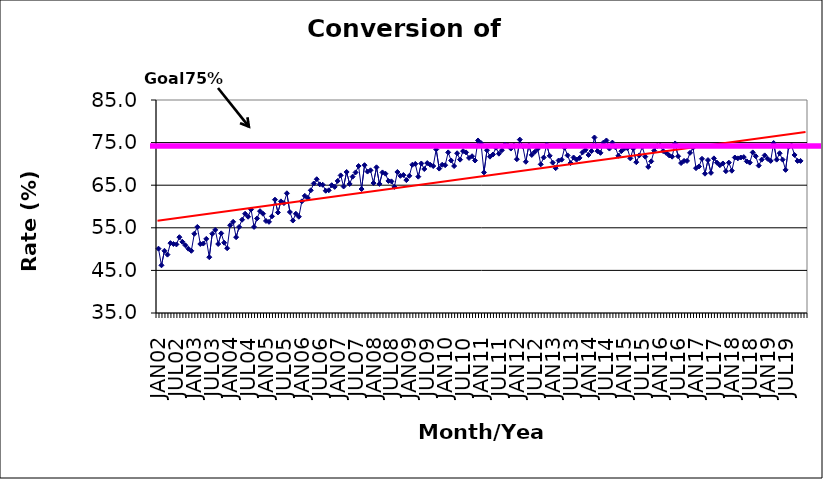
| Category | Series 0 |
|---|---|
| JAN02 | 50.1 |
| FEB02 | 46.2 |
| MAR02 | 49.6 |
| APR02 | 48.7 |
| MAY02 | 51.4 |
| JUN02 | 51.2 |
| JUL02 | 51.1 |
| AUG02 | 52.8 |
| SEP02 | 51.7 |
| OCT02 | 50.9 |
| NOV02 | 50.1 |
| DEC02 | 49.6 |
| JAN03 | 53.6 |
| FEB03 | 55.2 |
| MAR03 | 51.2 |
| APR03 | 51.3 |
| MAY03 | 52.4 |
| JUN03 | 48.1 |
| JUL03 | 53.6 |
| AUG03 | 54.5 |
| SEP03 | 51.2 |
| OCT03 | 53.7 |
| NOV03 | 51.5 |
| DEC03 | 50.2 |
| JAN04 | 55.6 |
| FEB04 | 56.4 |
| MAR04 | 52.8 |
| APR04 | 55.2 |
| MAY04 | 56.9 |
| JUN04 | 58.3 |
| JUL04 | 57.6 |
| AUG04 | 59.3 |
| SEP04 | 55.2 |
| OCT04 | 57.2 |
| NOV04 | 58.9 |
| DEC04 | 58.3 |
| JAN05 | 56.6 |
| FEB05 | 56.4 |
| MAR05 | 57.7 |
| APR05 | 61.6 |
| MAY05 | 58.6 |
| JUN05 | 61.2 |
| JUL05 | 60.8 |
| AUG05 | 63.1 |
| SEP05 | 58.7 |
| OCT05 | 56.7 |
| NOV05 | 58.3 |
| DEC05 | 57.6 |
| JAN06 | 61.2 |
| FEB06 | 62.5 |
| MAR06 | 62 |
| APR06 | 63.8 |
| MAY06 | 65.4 |
| JUN06 | 66.4 |
| JUL06 | 65.2 |
| AUG06 | 65.1 |
| SEP06 | 63.7 |
| OCT06 | 63.8 |
| NOV06 | 65 |
| DEC06 | 64.6 |
| JAN07 | 66 |
| FEB07 | 67.3 |
| MAR07 | 64.7 |
| APR07 | 68.1 |
| MAY07 | 65.3 |
| JUN07 | 67 |
| JUL07 | 68 |
| AUG07 | 69.5 |
| SEP07 | 64.1 |
| OCT07 | 69.7 |
| NOV07 | 68.2 |
| DEC07 | 68.5 |
| JAN08 | 65.5 |
| FEB08 | 69.2 |
| MAR08 | 65.3 |
| APR08 | 68 |
| MAY08 | 67.7 |
| JUN08 | 66 |
| JUL08 | 65.9 |
| AUG08 | 64.6 |
| SEP08 | 68.1 |
| OCT08 | 67.2 |
| NOV08 | 67.4 |
| DEC08 | 66.2 |
| JAN09 | 67.2 |
| FEB09 | 69.8 |
| MAR09 | 70 |
| APR09 | 67 |
| MAY09 | 70.1 |
| JUN09 | 68.8 |
| JUL09 | 70.2 |
| AUG09 | 69.8 |
| SEP09 | 69.5 |
| OCT09 | 73.4 |
| NOV09 | 68.9 |
| DEC09 | 69.8 |
| JAN10 | 69.7 |
| FEB10 | 72.7 |
| MAR10 | 70.8 |
| APR10 | 69.5 |
| MAY10 | 72.5 |
| JUN10 | 71 |
| JUL10 | 73 |
| AUG10 | 72.7 |
| SEP10 | 71.4 |
| OCT10 | 71.8 |
| NOV10 | 70.8 |
| DEC10 | 75.5 |
| JAN11 | 74.9 |
| FEB11 | 68 |
| MAR11 | 73.2 |
| APR11 | 71.7 |
| MAY11 | 72.2 |
| JUN11 | 73.8 |
| JUL11 | 72.4 |
| AUG11 | 73.2 |
| SEP11 | 74.5 |
| OCT11 | 74.3 |
| NOV11 | 73.6 |
| DEC11 | 74.3 |
| JAN12 | 71.1 |
| FEB12 | 75.7 |
| MAR12 | 74.1 |
| APR12 | 70.5 |
| MAY12 | 74.3 |
| JUN12 | 72.1 |
| JUL12 | 72.8 |
| AUG12 | 73.5 |
| SEP12 | 69.9 |
| OCT12 | 71.5 |
| NOV12 | 74.5 |
| DEC12 | 71.9 |
| JAN13 | 70.3 |
| FEB13 | 69 |
| MAR13 | 70.8 |
| APR13 | 71 |
| MAY13 | 73.8 |
| JUN13 | 72 |
| JUL13 | 70.2 |
| AUG13 | 71.5 |
| SEP13 | 71 |
| OCT13 | 71.4 |
| NOV13 | 72.7 |
| DEC13 | 73.3 |
| JAN14 | 72.1 |
| FEB14 | 73 |
| MAR14 | 76.2 |
| APR14 | 73 |
| MAY14 | 72.6 |
| JUN14 | 75 |
| JUL14 | 75.5 |
| AUG14 | 73.6 |
| SEP14 | 75 |
| OCT14 | 73.9 |
| NOV14 | 71.9 |
| DEC14 | 73 |
| JAN15 | 73.6 |
| FEB15 | 73.7 |
| MAR15 | 71.3 |
| APR15 | 73.6 |
| MAY15 | 70.4 |
| JUN15 | 72 |
| JUL15 | 74 |
| AUG15 | 71.7 |
| SEP15 | 69.3 |
| OCT15 | 70.6 |
| NOV15 | 73.1 |
| DEC15 | 74.2 |
| JAN16 | 74.3 |
| FEB16 | 73 |
| MAR16 | 72.6 |
| APR16 | 72 |
| MAY16 | 71.7 |
| JUN16 | 74.8 |
| JUL16 | 71.8 |
| AUG16 | 70.2 |
| SEP16 | 70.7 |
| OCT16 | 70.7 |
| NOV16 | 72.6 |
| DEC16 | 73.8 |
| JAN17 | 69 |
| FEB17 | 69.4 |
| MAR17 | 71.2 |
| APR17 | 67.7 |
| MAY17 | 70.9 |
| JUN17 | 67.9 |
| JUL17 | 71.3 |
| AUG17 | 70.3 |
| SEP17 | 69.7 |
| OCT17 | 70.1 |
| NOV17 | 68.3 |
| DEC17 | 70.3 |
| JAN18 | 68.4 |
| FEB18 | 71.5 |
| MAR18 | 71.3 |
| APR18 | 71.5 |
| MAY18 | 71.6 |
| JUN18 | 70.6 |
| JUL18 | 70.3 |
| AUG18 | 72.7 |
| SEP18 | 71.8 |
| OCT18 | 69.6 |
| NOV18 | 71 |
| DEC18 | 72 |
| JAN19 | 71.2 |
| FEB19 | 70.7 |
| MAR19 | 74.9 |
| APR19 | 71 |
| MAY19 | 72.5 |
| JUN19 | 71 |
| JUL19 | 68.6 |
| AUG19 | 74 |
| SEP19 | 74.3 |
| OCT19 | 72.1 |
| NOV19 | 70.7 |
| DEC19 | 70.7 |